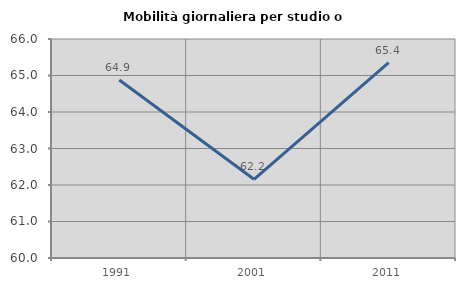
| Category | Mobilità giornaliera per studio o lavoro |
|---|---|
| 1991.0 | 64.879 |
| 2001.0 | 62.156 |
| 2011.0 | 65.356 |